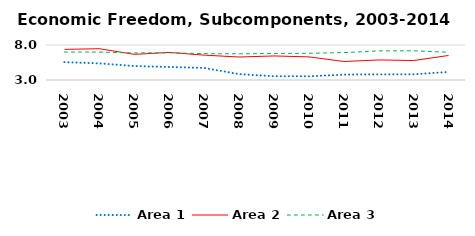
| Category | Area 1 | Area 2 | Area 3 |
|---|---|---|---|
| 2003.0 | 5.554 | 7.374 | 6.996 |
| 2004.0 | 5.37 | 7.467 | 6.985 |
| 2005.0 | 4.996 | 6.665 | 6.861 |
| 2006.0 | 4.857 | 6.939 | 6.889 |
| 2007.0 | 4.721 | 6.553 | 6.763 |
| 2008.0 | 3.843 | 6.285 | 6.739 |
| 2009.0 | 3.539 | 6.436 | 6.789 |
| 2010.0 | 3.526 | 6.301 | 6.817 |
| 2011.0 | 3.767 | 5.643 | 6.911 |
| 2012.0 | 3.805 | 5.864 | 7.158 |
| 2013.0 | 3.815 | 5.783 | 7.173 |
| 2014.0 | 4.149 | 6.505 | 6.963 |